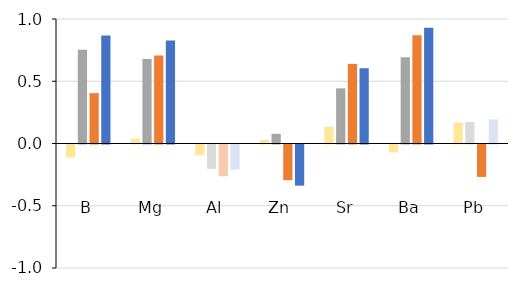
| Category | FO | IOM | ICE | GOM |
|---|---|---|---|---|
| B | -0.104 | 0.753 | 0.405 | 0.868 |
| Mg | 0.039 | 0.679 | 0.706 | 0.827 |
| Al | -0.086 | -0.195 | -0.255 | -0.202 |
| Zn | 0.03 | 0.078 | -0.287 | -0.33 |
| Sr | 0.135 | 0.443 | 0.64 | 0.604 |
| Ba | -0.063 | 0.693 | 0.87 | 0.93 |
| Pb | 0.168 | 0.173 | -0.26 | 0.194 |